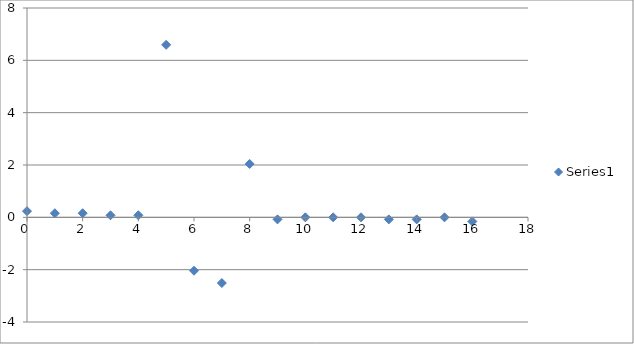
| Category | Series 0 |
|---|---|
| 0.0 | 0.235 |
| 1.0 | 0.157 |
| 2.0 | 0.157 |
| 3.0 | 0.078 |
| 4.0 | 0.078 |
| 5.0 | 6.592 |
| 6.0 | -2.041 |
| 7.0 | -2.511 |
| 8.0 | 2.041 |
| 9.0 | -0.078 |
| 10.0 | 0 |
| 11.0 | 0 |
| 12.0 | 0 |
| 13.0 | -0.078 |
| 14.0 | -0.078 |
| 15.0 | 0 |
| 16.0 | -0.157 |